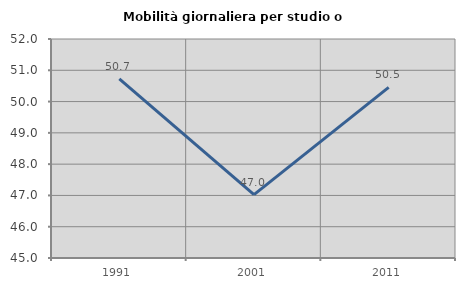
| Category | Mobilità giornaliera per studio o lavoro |
|---|---|
| 1991.0 | 50.728 |
| 2001.0 | 47.025 |
| 2011.0 | 50.455 |